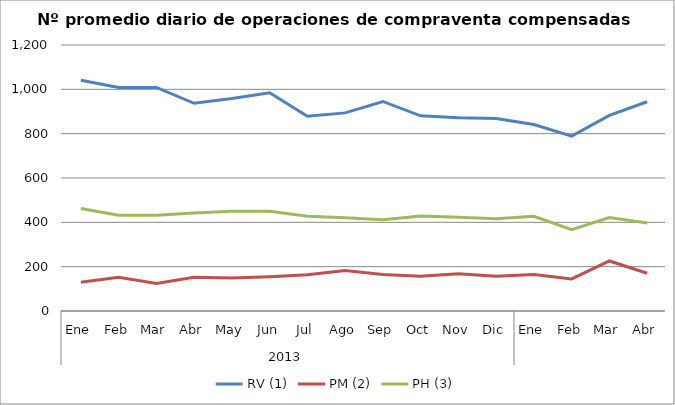
| Category | RV (1) | PM (2) | PH (3) |
|---|---|---|---|
| 0 | 1040.636 | 129.682 | 462.545 |
| 1 | 1008.7 | 152.35 | 432.05 |
| 2 | 1008.45 | 123.6 | 431.9 |
| 3 | 937.091 | 152.273 | 442.545 |
| 4 | 958.381 | 148.429 | 449.571 |
| 5 | 984.3 | 154.95 | 450 |
| 6 | 878.955 | 163.091 | 427.955 |
| 7 | 893.762 | 182.333 | 420.857 |
| 8 | 945.278 | 164.944 | 411.222 |
| 9 | 880.5 | 156.955 | 428.864 |
| 10 | 871.35 | 167.95 | 423.25 |
| 11 | 868.85 | 156.75 | 415.75 |
| 12 | 841.591 | 164.955 | 427.091 |
| 13 | 788.8 | 144.95 | 366.85 |
| 14 | 882.238 | 225.667 | 421.238 |
| 15 | 944 | 170.238 | 397.381 |